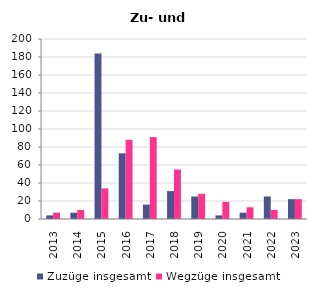
| Category | Zuzüge insgesamt | Wegzüge insgesamt |
|---|---|---|
| 2013.0 | 4 | 7 |
| 2014.0 | 7 | 10 |
| 2015.0 | 184 | 34 |
| 2016.0 | 73 | 88 |
| 2017.0 | 16 | 91 |
| 2018.0 | 31 | 55 |
| 2019.0 | 25 | 28 |
| 2020.0 | 4 | 19 |
| 2021.0 | 7 | 13 |
| 2022.0 | 25 | 10 |
| 2023.0 | 22 | 22 |